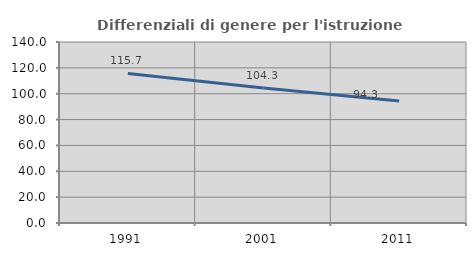
| Category | Differenziali di genere per l'istruzione superiore |
|---|---|
| 1991.0 | 115.711 |
| 2001.0 | 104.345 |
| 2011.0 | 94.275 |